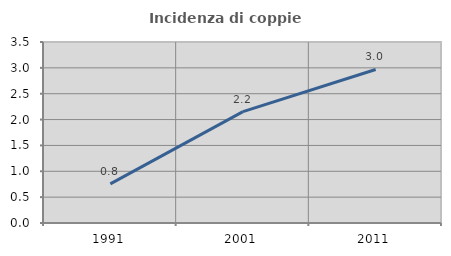
| Category | Incidenza di coppie miste |
|---|---|
| 1991.0 | 0.756 |
| 2001.0 | 2.154 |
| 2011.0 | 2.969 |